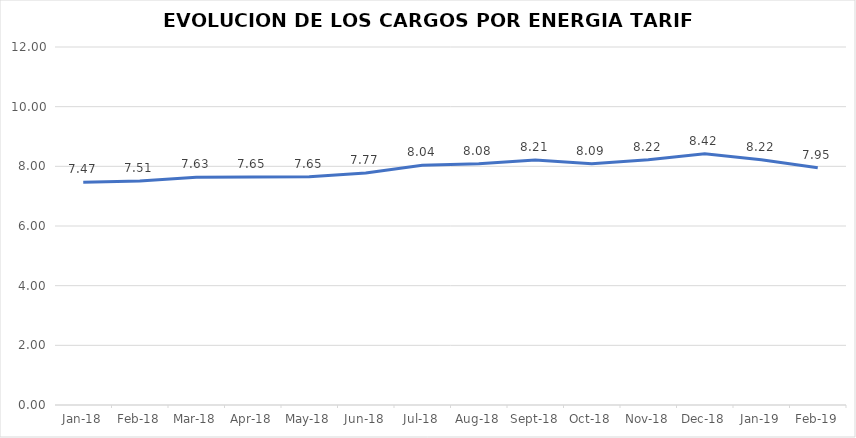
| Category | Series 0 |
|---|---|
| 2018-01-01 | 7.465 |
| 2018-02-01 | 7.51 |
| 2018-03-01 | 7.631 |
| 2018-04-01 | 7.647 |
| 2018-05-01 | 7.65 |
| 2018-06-01 | 7.775 |
| 2018-07-01 | 8.039 |
| 2018-08-01 | 8.083 |
| 2018-09-01 | 8.21 |
| 2018-10-01 | 8.091 |
| 2018-11-01 | 8.22 |
| 2018-12-01 | 8.42 |
| 2019-01-01 | 8.222 |
| 2019-02-01 | 7.952 |